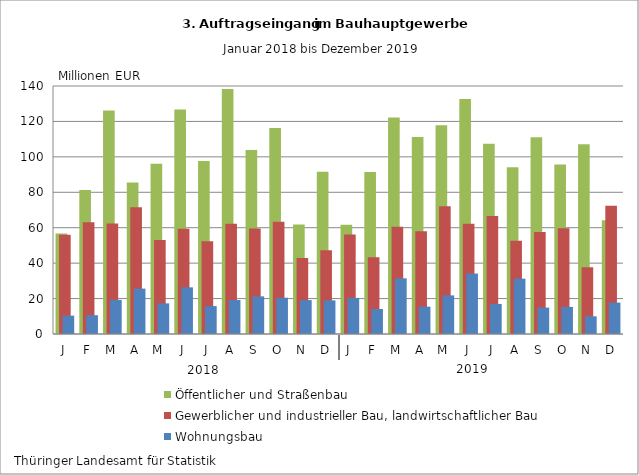
| Category | Öffentlicher und Straßenbau | Gewerblicher und industrieller Bau, landwirtschaftlicher Bau | Wohnungsbau |
|---|---|---|---|
| J | 56.784 | 56.072 | 10.358 |
| F | 81.276 | 63.052 | 10.612 |
| M | 126.205 | 62.388 | 19.26 |
| A | 85.569 | 71.56 | 25.618 |
| M | 96.043 | 52.997 | 17.286 |
| J | 126.756 | 59.446 | 26.337 |
| J | 97.71 | 52.375 | 15.763 |
| A | 138.291 | 62.294 | 19.198 |
| S | 103.89 | 59.54 | 21.25 |
| O | 116.342 | 63.408 | 20.476 |
| N | 61.799 | 42.857 | 19.143 |
| D | 91.622 | 47.279 | 18.98 |
| J | 61.69 | 56.233 | 20.365 |
| F | 91.411 | 43.325 | 14.108 |
| M | 122.252 | 60.475 | 31.437 |
| A | 111.149 | 58.038 | 15.419 |
| M | 117.863 | 72.11 | 21.8 |
| J | 132.621 | 62.253 | 34.13 |
| J | 107.368 | 66.65 | 16.981 |
| A | 94.135 | 52.591 | 31.245 |
| S | 111.01 | 57.583 | 14.884 |
| O | 95.748 | 59.67 | 15.291 |
| N | 107.073 | 37.655 | 9.972 |
| D | 64.218 | 72.395 | 17.714 |